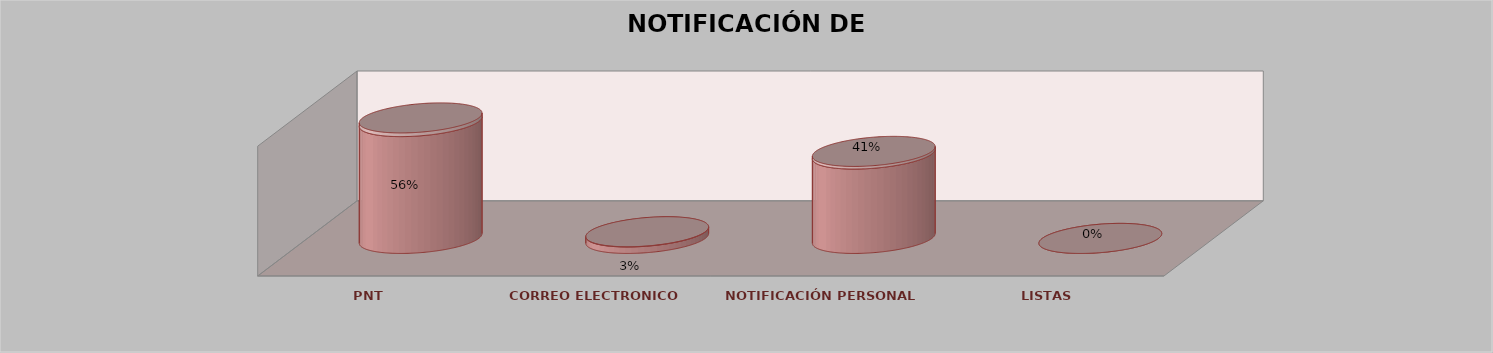
| Category | Series 0 | Series 1 | Series 2 | Series 3 | Series 4 |
|---|---|---|---|---|---|
| PNT |  |  |  | 18 | 0.562 |
| CORREO ELECTRONICO |  |  |  | 1 | 0.031 |
| NOTIFICACIÓN PERSONAL |  |  |  | 13 | 0.406 |
| LISTAS |  |  |  | 0 | 0 |